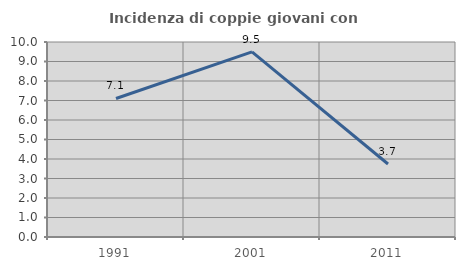
| Category | Incidenza di coppie giovani con figli |
|---|---|
| 1991.0 | 7.104 |
| 2001.0 | 9.497 |
| 2011.0 | 3.743 |